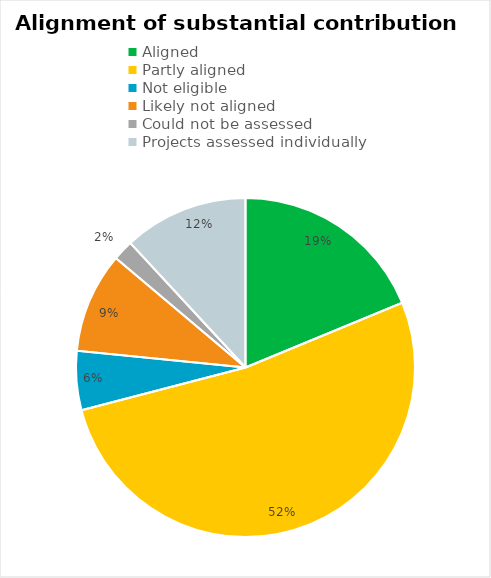
| Category | Series 0 |
|---|---|
| Aligned | 0.188 |
| Partly aligned | 0.522 |
| Not eligible  | 0.056 |
| Likely not aligned | 0.096 |
| Could not be assessed  | 0.02 |
| Projects assessed individually  | 0.119 |